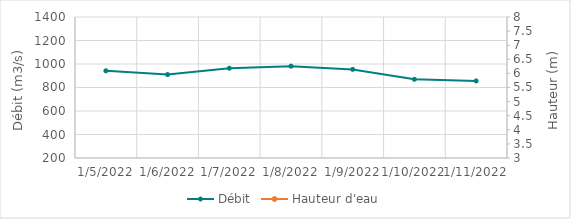
| Category | Débit |
|---|---|
| 8/1/21 | 1247.64 |
| 7/31/21 | 1293.79 |
| 7/30/21 | 1286.56 |
| 7/29/21 | 1253.28 |
| 7/28/21 | 1187.11 |
| 7/27/21 | 1216.65 |
| 7/26/21 | 1225.57 |